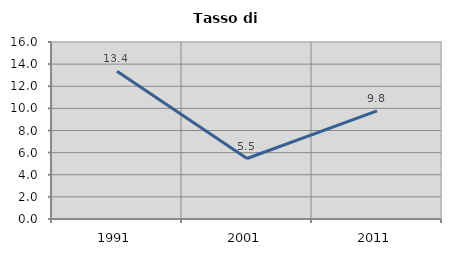
| Category | Tasso di disoccupazione   |
|---|---|
| 1991.0 | 13.358 |
| 2001.0 | 5.468 |
| 2011.0 | 9.771 |